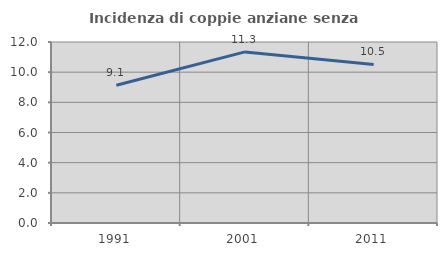
| Category | Incidenza di coppie anziane senza figli  |
|---|---|
| 1991.0 | 9.137 |
| 2001.0 | 11.345 |
| 2011.0 | 10.515 |